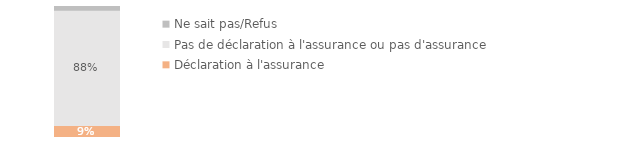
| Category | Déclaration à l'assurance | Pas de déclaration à l'assurance ou pas d'assurance | Ne sait pas/Refus |
|---|---|---|---|
| Ensemble des ménages victimes | 0.091 | 0.881 | 0.028 |